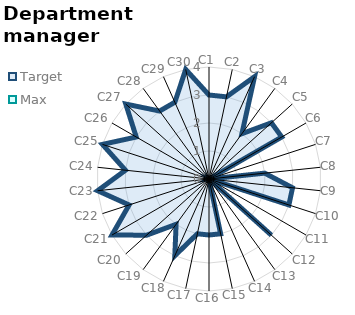
| Category | Target | Max |
|---|---|---|
| C1 | 3 | 0 |
| C2 | 3 | 0 |
| C3 | 4 | 0 |
| C4 | 2 | 0 |
| C5 | 3 | 0 |
| C6 | 3 | 0 |
| C7 | 0 | 0 |
| C8 | 2 | 0 |
| C9 | 3 | 0 |
| C10 | 3 | 0 |
| C11 | 0 | 0 |
| C12 | 3 | 0 |
| C13 | 0 | 0 |
| C14 | 0 | 0 |
| C15 | 2 | 0 |
| C16 | 2 | 0 |
| C17 | 2 | 0 |
| C18 | 3 | 0 |
| C19 | 2 | 0 |
| C20 | 3 | 0 |
| C21 | 4 | 0 |
| C22 | 3 | 0 |
| C23 | 4 | 0 |
| C24 | 3 | 0 |
| C25 | 4 | 0 |
| C26 | 3 | 0 |
| C27 | 4 | 0 |
| C28 | 3 | 0 |
| C29 | 3 | 0 |
| C30 | 4 | 0 |